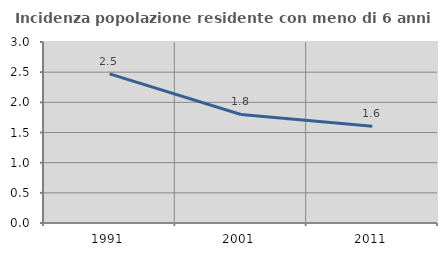
| Category | Incidenza popolazione residente con meno di 6 anni |
|---|---|
| 1991.0 | 2.473 |
| 2001.0 | 1.799 |
| 2011.0 | 1.603 |